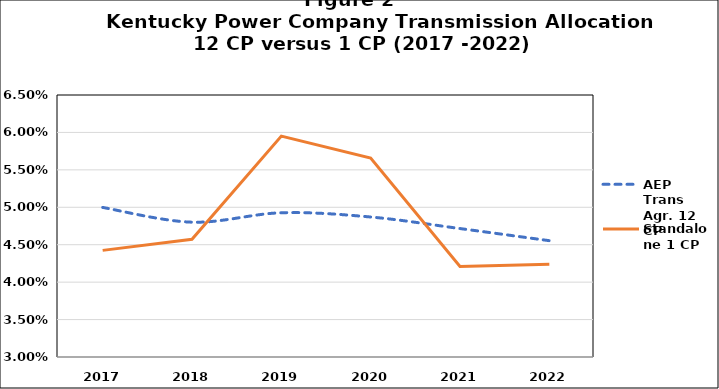
| Category | AEP Trans Agr. 12 CP | Standalone 1 CP |
|---|---|---|
| 2017.0 | 0.05 | 0.044 |
| 2018.0 | 0.048 | 0.046 |
| 2019.0 | 0.049 | 0.06 |
| 2020.0 | 0.049 | 0.057 |
| 2021.0 | 0.047 | 0.042 |
| 2022.0 | 0.046 | 0.042 |